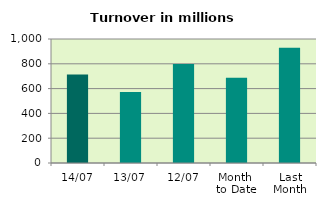
| Category | Series 0 |
|---|---|
| 14/07 | 714.565 |
| 13/07 | 571.782 |
| 12/07 | 797.535 |
| Month 
to Date | 687.211 |
| Last
Month | 929.439 |